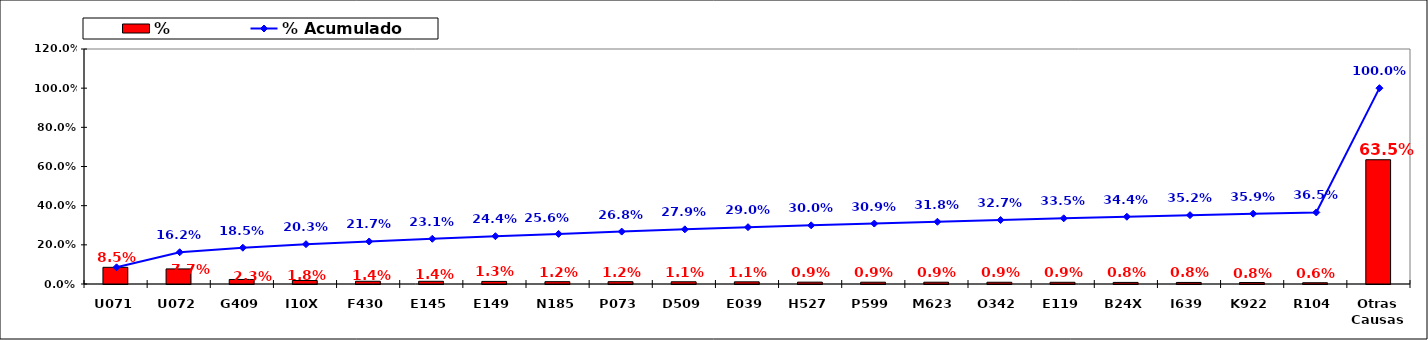
| Category | % |
|---|---|
| U071 | 0.085 |
| U072 | 0.077 |
| G409 | 0.023 |
| I10X | 0.018 |
| F430 | 0.014 |
| E145 | 0.014 |
| E149 | 0.013 |
| N185 | 0.012 |
| P073 | 0.012 |
| D509 | 0.011 |
| E039 | 0.011 |
| H527 | 0.009 |
| P599 | 0.009 |
| M623 | 0.009 |
| O342 | 0.009 |
| E119 | 0.009 |
| B24X | 0.008 |
| I639 | 0.008 |
| K922 | 0.008 |
| R104 | 0.006 |
| Otras Causas | 0.635 |